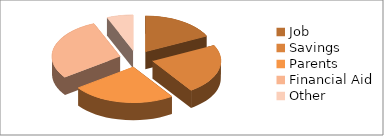
| Category | Series 0 | Series 1 | Series 2 | Series 3 |
|---|---|---|---|---|
| Job | 3400 | 3604 | 3820.24 | 4049.45 |
| Savings | 4350 | 4611 | 4887.66 | 5180.92 |
| Parents | 4700 | 4982 | 5280.92 | 5597.78 |
| Financial Aid | 5500 | 5830 | 6179.8 | 6550.59 |
| Other | 1200 | 1272 | 1348.32 | 1429.22 |